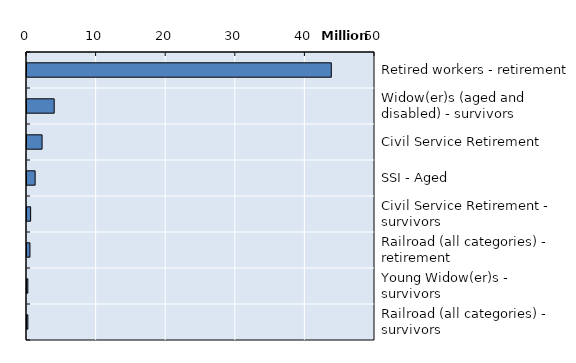
| Category | Series 0 |
|---|---|
| Retired workers - retirement  | 43721450 |
| Widow(er)s (aged and disabled) - survivors | 3907966 |
| Civil Service Retirement | 2166000 |
| SSI - Aged | 1169087 |
| Civil Service Retirement - survivors | 523000 |
| Railroad (all categories) - retirement | 423000 |
| Young Widow(er)s - survivors | 120640 |
| Railroad (all categories) - survivors | 123000 |